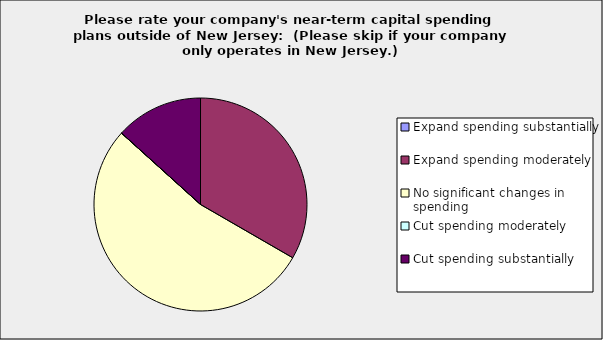
| Category | Series 0 |
|---|---|
| Expand spending substantially | 0 |
| Expand spending moderately | 0.333 |
| No significant changes in spending | 0.533 |
| Cut spending moderately | 0 |
| Cut spending substantially | 0.133 |